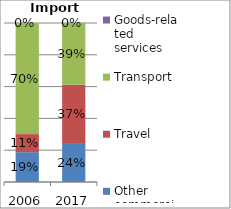
| Category | Other commercial services | Travel | Transport | Goods-related services |
|---|---|---|---|---|
| 2006.0 | 0.187 | 0.114 | 0.699 | 0 |
| 2017.0 | 0.245 | 0.367 | 0.388 | 0 |